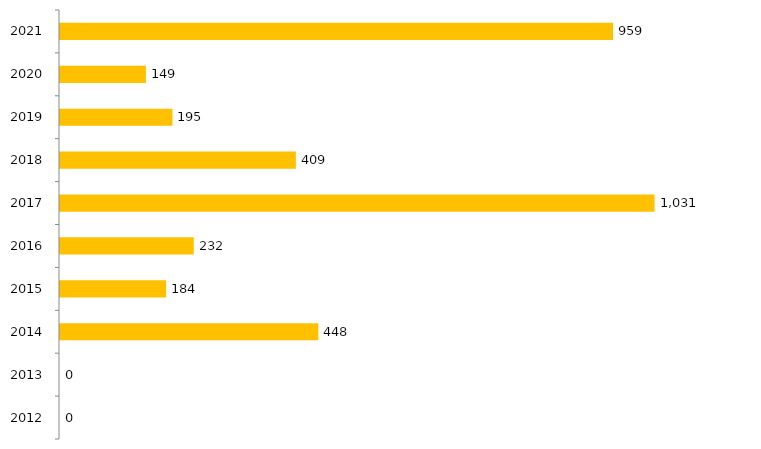
| Category | Series 1 |
|---|---|
| 2012.0 | 0 |
| 2013.0 | 0 |
| 2014.0 | 448 |
| 2015.0 | 184 |
| 2016.0 | 232 |
| 2017.0 | 1031 |
| 2018.0 | 409 |
| 2019.0 | 195 |
| 2020.0 | 149 |
| 2021.0 | 959 |